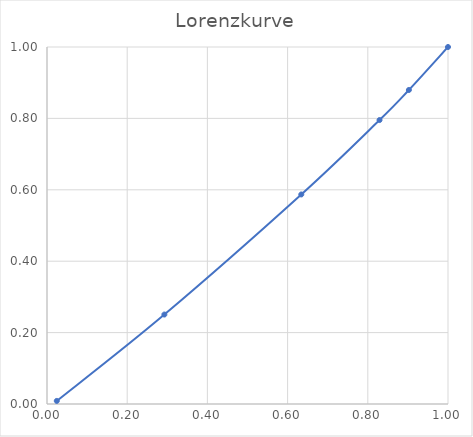
| Category | y |
|---|---|
| 0.024390243902439025 | 0.009 |
| 0.2926829268292683 | 0.251 |
| 0.6341463414634146 | 0.587 |
| 0.8292682926829268 | 0.795 |
| 0.9024390243902439 | 0.88 |
| 1.0 | 1 |